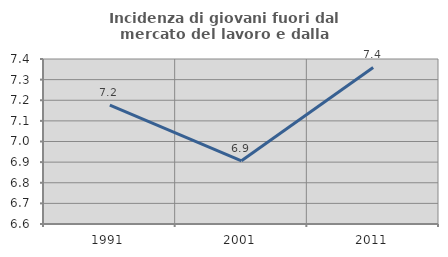
| Category | Incidenza di giovani fuori dal mercato del lavoro e dalla formazione  |
|---|---|
| 1991.0 | 7.176 |
| 2001.0 | 6.906 |
| 2011.0 | 7.359 |